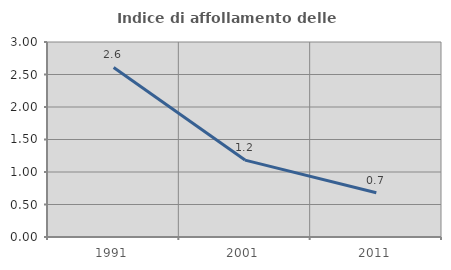
| Category | Indice di affollamento delle abitazioni  |
|---|---|
| 1991.0 | 2.608 |
| 2001.0 | 1.183 |
| 2011.0 | 0.682 |